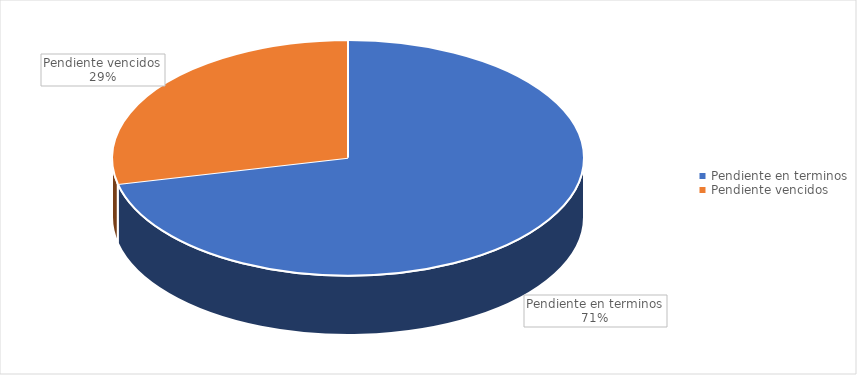
| Category | Total |
|---|---|
| Pendiente en terminos | 5 |
| Pendiente vencidos | 2 |